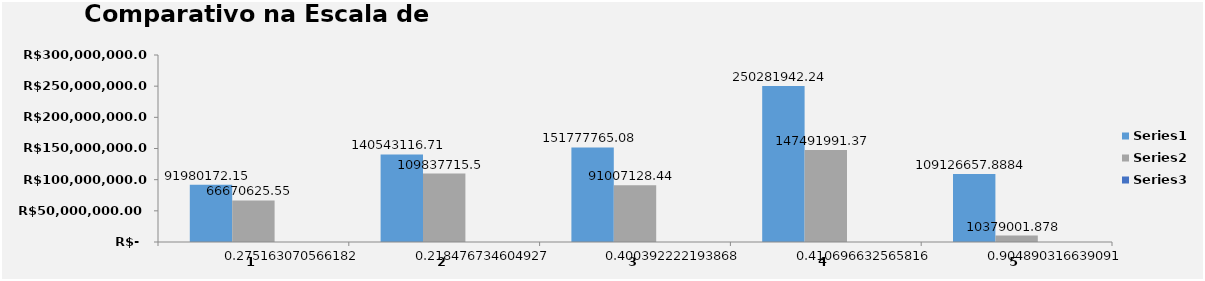
| Category | Series 0 | Series 1 | Series 2 |
|---|---|---|---|
| 0 | 91980172.15 | 66670625.55 | 0.275 |
| 1 | 140543116.71 | 109837715.5 | 0.218 |
| 2 | 151777765.08 | 91007128.44 | 0.4 |
| 3 | 250281942.24 | 147491991.37 | 0.411 |
| 4 | 109126657.888 | 10379001.878 | 0.905 |